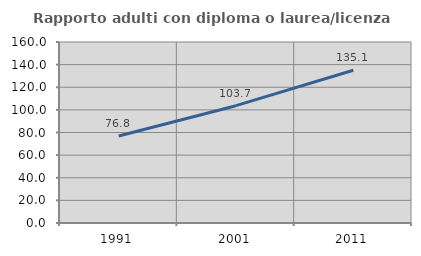
| Category | Rapporto adulti con diploma o laurea/licenza media  |
|---|---|
| 1991.0 | 76.845 |
| 2001.0 | 103.705 |
| 2011.0 | 135.052 |